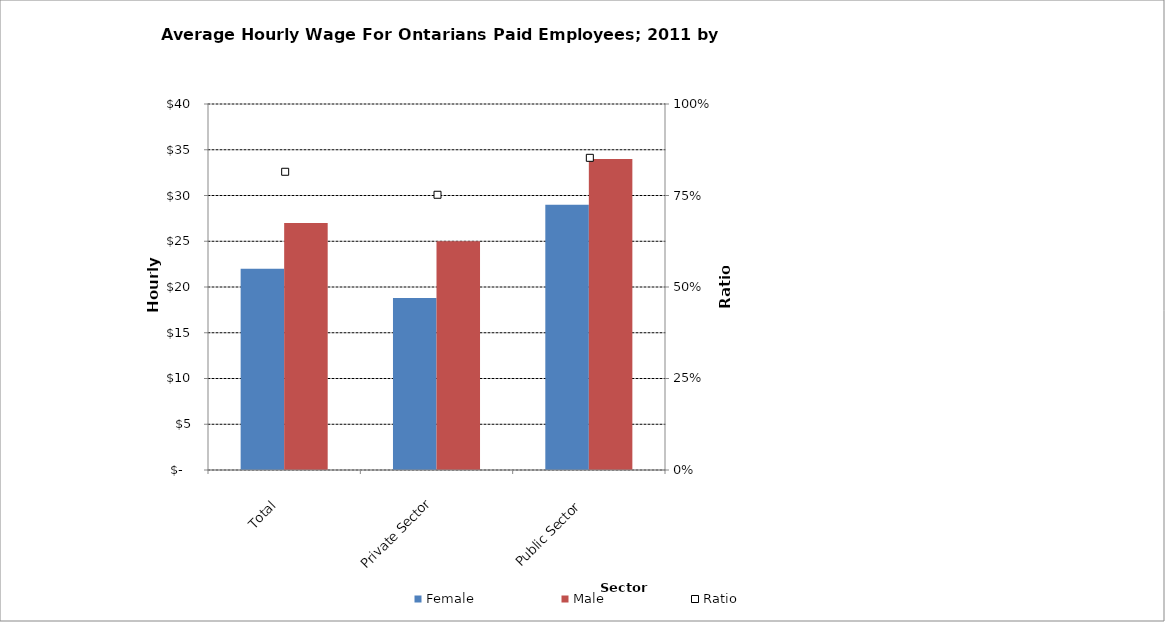
| Category | Female | Male |
|---|---|---|
| Total | 22 | 27 |
|  Private Sector  | 18.8 | 25 |
|  Public Sector  | 29 | 34 |